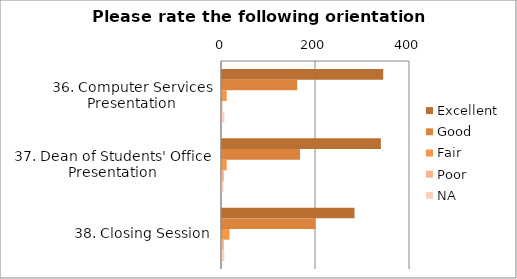
| Category | Excellent | Good | Fair | Poor | NA |
|---|---|---|---|---|---|
| 36. Computer Services Presentation | 343 | 160 | 10 | 1 | 5 |
| 37. Dean of Students' Office Presentation | 338 | 166 | 10 | 4 | 3 |
| 38. Closing Session | 282 | 199 | 16 | 4 | 5 |